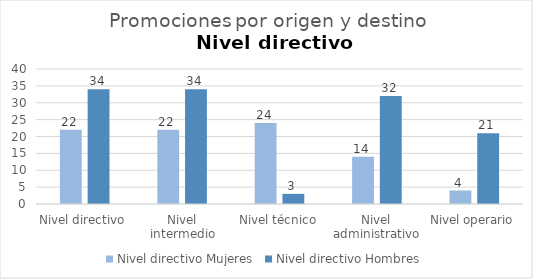
| Category | Nivel directivo |
|---|---|
| Nivel directivo | 34 |
| Nivel intermedio | 34 |
| Nivel técnico | 3 |
| Nivel administrativo | 32 |
| Nivel operario | 21 |